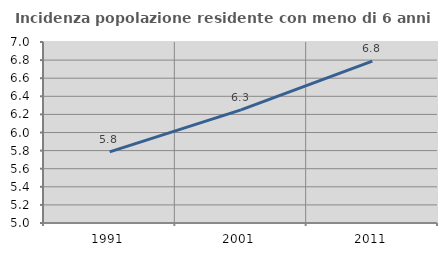
| Category | Incidenza popolazione residente con meno di 6 anni |
|---|---|
| 1991.0 | 5.785 |
| 2001.0 | 6.25 |
| 2011.0 | 6.788 |